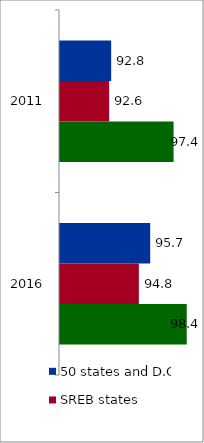
| Category | 50 states and D.C. | SREB states | State |
|---|---|---|---|
| 2011.0 | 92.79 | 92.641 | 97.412 |
| 2016.0 | 95.682 | 94.841 | 98.388 |